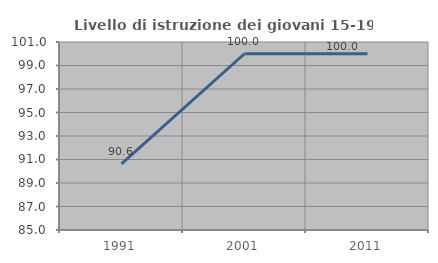
| Category | Livello di istruzione dei giovani 15-19 anni |
|---|---|
| 1991.0 | 90.625 |
| 2001.0 | 100 |
| 2011.0 | 100 |